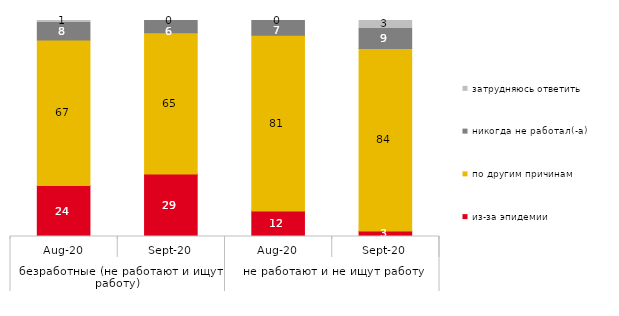
| Category | из-за эпидемии | по другим причинам | никогда не работал(-а) | затрудняюсь ответить |
|---|---|---|---|---|
| 0 | 23.611 | 67.361 | 8.333 | 0.694 |
| 1 | 28.931 | 65.409 | 5.66 | 0 |
| 2 | 11.765 | 81.373 | 6.863 | 0 |
| 3 | 2.586 | 84.483 | 9.483 | 3.448 |